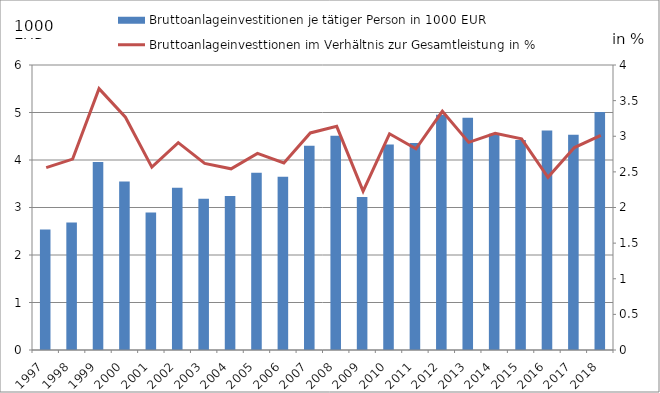
| Category | Bruttoanlageinvestitionen je tätiger Person in 1000 EUR |
|---|---|
| 1997.0 | 2.538 |
| 1998.0 | 2.683 |
| 1999.0 | 3.96 |
| 2000.0 | 3.549 |
| 2001.0 | 2.897 |
| 2002.0 | 3.414 |
| 2003.0 | 3.186 |
| 2004.0 | 3.244 |
| 2005.0 | 3.734 |
| 2006.0 | 3.649 |
| 2007.0 | 4.3 |
| 2008.0 | 4.51 |
| 2009.0 | 3.22 |
| 2010.0 | 4.327 |
| 2011.0 | 4.357 |
| 2012.0 | 4.955 |
| 2013.0 | 4.887 |
| 2014.0 | 4.555 |
| 2015.0 | 4.422 |
| 2016.0 | 4.62 |
| 2017.0 | 4.529 |
| 2018.0 | 5.01 |